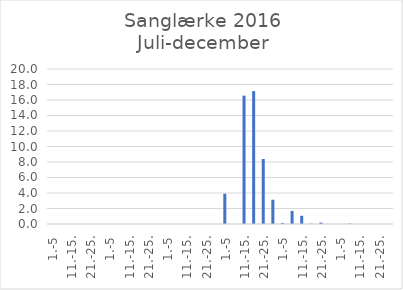
| Category | Series 0 |
|---|---|
| 1.-5 | 0 |
| 6.-10. | 0 |
| 11.-15. | 0 |
| 16.-20. | 0 |
| 21.-25. | 0 |
| 26.-31. | 0 |
| 1.-5 | 0 |
| 6.-10. | 0 |
| 11.-15. | 0 |
| 16.-20. | 0 |
| 21.-25. | 0 |
| 26.-31. | 0 |
| 1.-5 | 0 |
| 6.-10. | 0 |
| 11.-15. | 0 |
| 16.-20. | 0 |
| 21.-25. | 0 |
| 26.-30. | 0 |
| 1.-5 | 3.9 |
| 6.-10. | 0 |
| 11.-15. | 16.564 |
| 16.-20. | 17.147 |
| 21.-25. | 8.382 |
| 26.-31. | 3.129 |
| 1.-5 | 0.137 |
| 6.-10. | 1.684 |
| 11.-15. | 1.058 |
| 16.-20. | 0.038 |
| 21.-25. | 0.183 |
| 26.-30. | 0 |
| 1.-5 | 0 |
| 6.-10. | 0.056 |
| 11.-15. | 0 |
| 16.-20. | 0 |
| 21.-25. | 0 |
| 26.-31. | 0 |